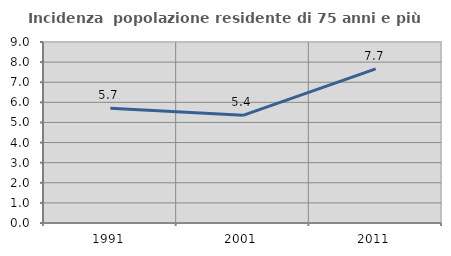
| Category | Incidenza  popolazione residente di 75 anni e più |
|---|---|
| 1991.0 | 5.708 |
| 2001.0 | 5.355 |
| 2011.0 | 7.662 |